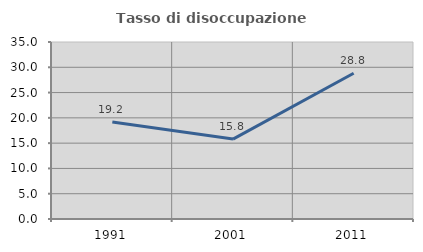
| Category | Tasso di disoccupazione giovanile  |
|---|---|
| 1991.0 | 19.161 |
| 2001.0 | 15.805 |
| 2011.0 | 28.832 |